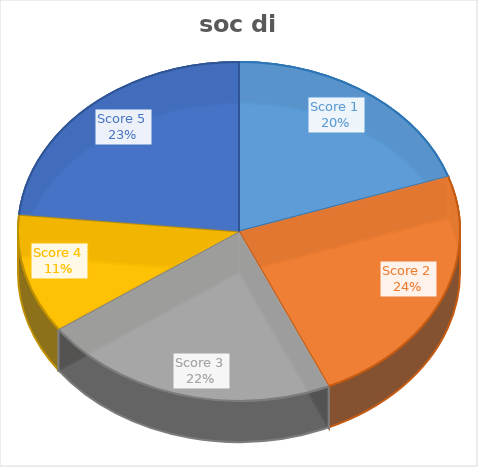
| Category | conta |
|---|---|
| Score 1 | 201047 |
| Score 2 | 240028 |
| Score 3 | 222432 |
| Score 4 | 115517 |
| Score 5 | 238476 |